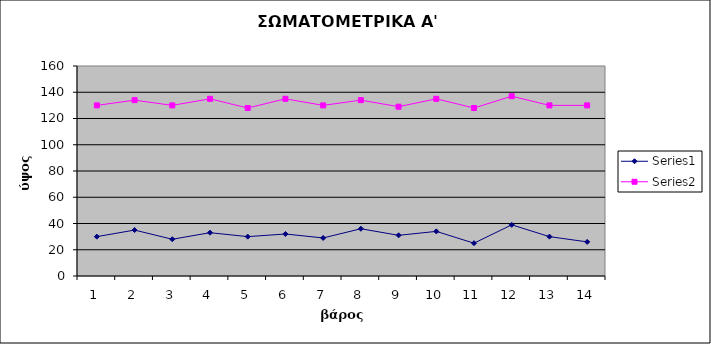
| Category | Series 0 | Series 1 |
|---|---|---|
| 0 | 30 | 130 |
| 1 | 35 | 134 |
| 2 | 28 | 130 |
| 3 | 33 | 135 |
| 4 | 30 | 128 |
| 5 | 32 | 135 |
| 6 | 29 | 130 |
| 7 | 36 | 134 |
| 8 | 31 | 129 |
| 9 | 34 | 135 |
| 10 | 25 | 128 |
| 11 | 39 | 137 |
| 12 | 30 | 130 |
| 13 | 26 | 130 |